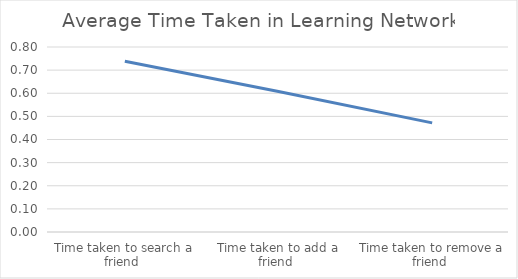
| Category | Series 0 |
|---|---|
| Time taken to search a friend  | 0.738 |
| Time taken to add a friend  | 0.607 |
| Time taken to remove a friend  | 0.472 |